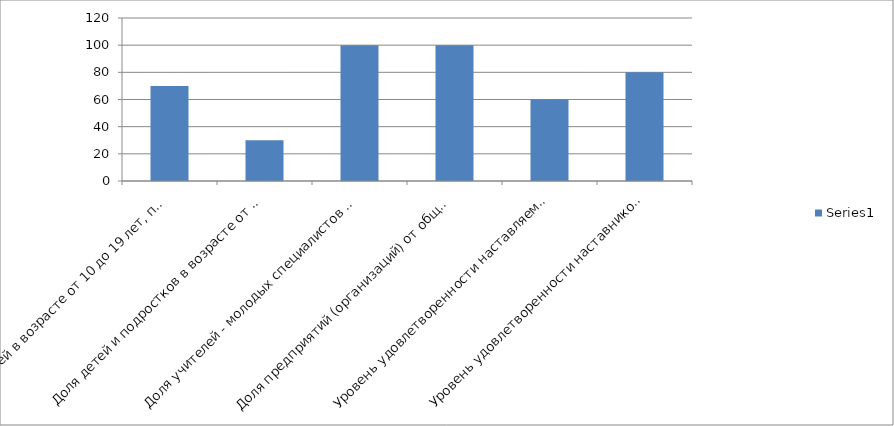
| Category | Series 0 |
|---|---|
| Доля детей в возрасте от 10 до 19 лет, проживающих на территории, вошедших в программы наставничества в роли наставляемого | 70 |
| Доля детей и подростков в возрасте от 15 до 19 лет, проживающих на территории, вошедших в программы наставничества в роли наставника | 30 |
| Доля учителей - молодых специалистов (с опытом работы от 0 до 3 лет), проживающих на территории, вошедших в программы наставничества в роли наставляемого, | 100 |
| Доля предприятий (организаций) от общего количества предприятий, осуществляющих деятельность на территории, вошедших в программы наставничества, предоставив своих наставников | 100 |
| Уровень удовлетворенности наставляемых участием в программах наставничества | 60 |
| Уровень удовлетворенности наставников участием в программах наставничества | 80 |